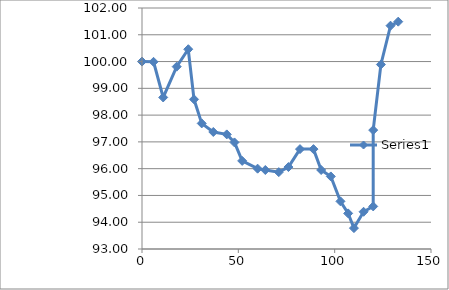
| Category | Series 0 |
|---|---|
| 0.0 | 100 |
| 6.0 | 99.99 |
| 11.0 | 98.66 |
| 18.0 | 99.81 |
| 24.0 | 100.46 |
| 27.0 | 98.59 |
| 31.0 | 97.69 |
| 37.0 | 97.37 |
| 44.0 | 97.28 |
| 48.0 | 96.98 |
| 52.0 | 96.29 |
| 60.0 | 96 |
| 64.0 | 95.95 |
| 71.0 | 95.87 |
| 76.0 | 96.06 |
| 82.0 | 96.73 |
| 89.0 | 96.73 |
| 93.0 | 95.95 |
| 98.0 | 95.71 |
| 103.0 | 94.78 |
| 107.0 | 94.33 |
| 110.0 | 93.78 |
| 115.0 | 94.39 |
| 120.0 | 94.59 |
| 120.0 | 97.44 |
| 124.0 | 99.89 |
| 129.0 | 101.34 |
| 133.0 | 101.49 |